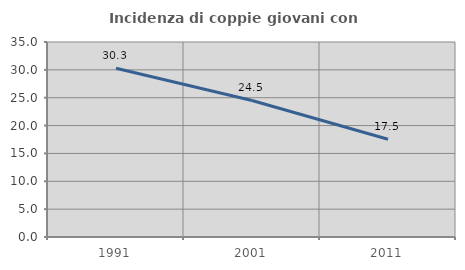
| Category | Incidenza di coppie giovani con figli |
|---|---|
| 1991.0 | 30.278 |
| 2001.0 | 24.5 |
| 2011.0 | 17.545 |